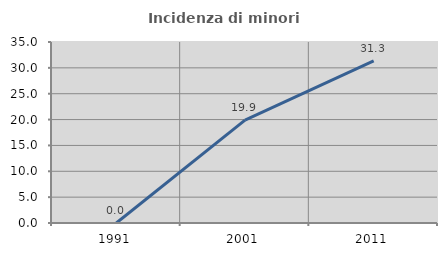
| Category | Incidenza di minori stranieri |
|---|---|
| 1991.0 | 0 |
| 2001.0 | 19.88 |
| 2011.0 | 31.339 |